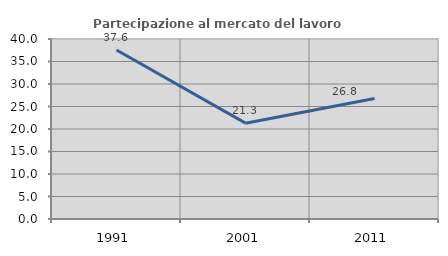
| Category | Partecipazione al mercato del lavoro  femminile |
|---|---|
| 1991.0 | 37.567 |
| 2001.0 | 21.295 |
| 2011.0 | 26.799 |